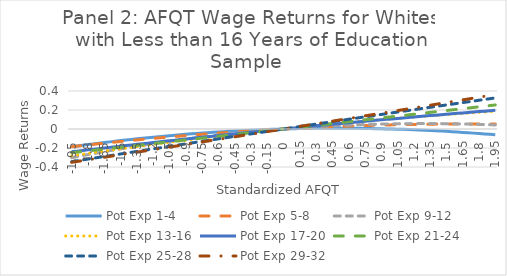
| Category | Pot Exp 1-4 | Pot Exp 5-8 | Pot Exp 9-12 | Pot Exp 13-16 | Pot Exp 17-20 | Pot Exp 21-24 | Pot Exp 25-28 | Pot Exp 29-32 |
|---|---|---|---|---|---|---|---|---|
| -1.95 | -0.188 | -0.186 | -0.302 | -0.282 | -0.24 | -0.25 | -0.344 | -0.351 |
| -1.9 | -0.18 | -0.18 | -0.291 | -0.273 | -0.233 | -0.244 | -0.335 | -0.342 |
| -1.8499999999999999 | -0.172 | -0.174 | -0.28 | -0.265 | -0.226 | -0.237 | -0.326 | -0.333 |
| -1.7999999999999998 | -0.164 | -0.167 | -0.269 | -0.257 | -0.22 | -0.231 | -0.317 | -0.324 |
| -1.7499999999999998 | -0.157 | -0.161 | -0.259 | -0.249 | -0.213 | -0.225 | -0.308 | -0.315 |
| -1.6999999999999997 | -0.15 | -0.155 | -0.249 | -0.24 | -0.207 | -0.218 | -0.299 | -0.306 |
| -1.6499999999999997 | -0.142 | -0.149 | -0.239 | -0.232 | -0.2 | -0.212 | -0.29 | -0.298 |
| -1.5999999999999996 | -0.136 | -0.143 | -0.229 | -0.224 | -0.194 | -0.205 | -0.281 | -0.289 |
| -1.5499999999999996 | -0.129 | -0.137 | -0.219 | -0.216 | -0.187 | -0.199 | -0.272 | -0.28 |
| -1.4999999999999996 | -0.122 | -0.132 | -0.209 | -0.208 | -0.181 | -0.193 | -0.263 | -0.271 |
| -1.4499999999999995 | -0.116 | -0.126 | -0.2 | -0.2 | -0.174 | -0.186 | -0.254 | -0.262 |
| -1.3999999999999995 | -0.109 | -0.12 | -0.19 | -0.193 | -0.168 | -0.18 | -0.245 | -0.253 |
| -1.3499999999999994 | -0.103 | -0.115 | -0.181 | -0.185 | -0.161 | -0.173 | -0.236 | -0.244 |
| -1.2999999999999994 | -0.097 | -0.109 | -0.172 | -0.177 | -0.155 | -0.167 | -0.227 | -0.235 |
| -1.2499999999999993 | -0.092 | -0.104 | -0.164 | -0.17 | -0.149 | -0.161 | -0.218 | -0.226 |
| -1.1999999999999993 | -0.086 | -0.099 | -0.155 | -0.162 | -0.142 | -0.154 | -0.209 | -0.217 |
| -1.1499999999999992 | -0.081 | -0.094 | -0.147 | -0.155 | -0.136 | -0.148 | -0.201 | -0.208 |
| -1.0999999999999992 | -0.075 | -0.089 | -0.138 | -0.147 | -0.13 | -0.141 | -0.192 | -0.199 |
| -1.0499999999999992 | -0.07 | -0.084 | -0.13 | -0.14 | -0.124 | -0.135 | -0.183 | -0.19 |
| -0.9999999999999991 | -0.065 | -0.079 | -0.122 | -0.133 | -0.118 | -0.129 | -0.174 | -0.181 |
| -0.9499999999999991 | -0.06 | -0.074 | -0.115 | -0.125 | -0.111 | -0.122 | -0.165 | -0.172 |
| -0.899999999999999 | -0.056 | -0.069 | -0.107 | -0.118 | -0.105 | -0.116 | -0.157 | -0.163 |
| -0.849999999999999 | -0.051 | -0.065 | -0.1 | -0.111 | -0.099 | -0.109 | -0.148 | -0.154 |
| -0.7999999999999989 | -0.047 | -0.06 | -0.092 | -0.104 | -0.093 | -0.103 | -0.139 | -0.145 |
| -0.7499999999999989 | -0.043 | -0.056 | -0.085 | -0.097 | -0.087 | -0.097 | -0.13 | -0.136 |
| -0.6999999999999988 | -0.039 | -0.052 | -0.079 | -0.09 | -0.081 | -0.09 | -0.121 | -0.127 |
| -0.6499999999999988 | -0.035 | -0.047 | -0.072 | -0.083 | -0.075 | -0.084 | -0.113 | -0.118 |
| -0.5999999999999988 | -0.031 | -0.043 | -0.065 | -0.077 | -0.069 | -0.077 | -0.104 | -0.109 |
| -0.5499999999999987 | -0.028 | -0.039 | -0.059 | -0.07 | -0.063 | -0.071 | -0.095 | -0.1 |
| -0.4999999999999987 | -0.024 | -0.035 | -0.053 | -0.063 | -0.057 | -0.064 | -0.087 | -0.091 |
| -0.44999999999999873 | -0.021 | -0.031 | -0.047 | -0.057 | -0.052 | -0.058 | -0.078 | -0.082 |
| -0.39999999999999875 | -0.018 | -0.027 | -0.041 | -0.05 | -0.046 | -0.052 | -0.069 | -0.073 |
| -0.34999999999999876 | -0.015 | -0.024 | -0.035 | -0.044 | -0.04 | -0.045 | -0.06 | -0.064 |
| -0.29999999999999877 | -0.013 | -0.02 | -0.03 | -0.037 | -0.034 | -0.039 | -0.052 | -0.055 |
| -0.24999999999999878 | -0.01 | -0.016 | -0.024 | -0.031 | -0.028 | -0.032 | -0.043 | -0.046 |
| -0.1999999999999988 | -0.008 | -0.013 | -0.019 | -0.025 | -0.023 | -0.026 | -0.034 | -0.037 |
| -0.1499999999999988 | -0.006 | -0.01 | -0.014 | -0.018 | -0.017 | -0.019 | -0.026 | -0.027 |
| -0.0999999999999988 | -0.004 | -0.006 | -0.009 | -0.012 | -0.011 | -0.013 | -0.017 | -0.018 |
| -0.049999999999998795 | -0.002 | -0.003 | -0.005 | -0.006 | -0.006 | -0.006 | -0.009 | -0.009 |
| 0.0 | 0 | 0 | 0 | 0 | 0 | 0 | 0 | 0 |
| 0.05 | 0.002 | 0.003 | 0.004 | 0.006 | 0.006 | 0.006 | 0.009 | 0.009 |
| 0.1 | 0.003 | 0.006 | 0.008 | 0.012 | 0.011 | 0.013 | 0.017 | 0.018 |
| 0.15000000000000002 | 0.004 | 0.009 | 0.012 | 0.018 | 0.017 | 0.019 | 0.026 | 0.027 |
| 0.2 | 0.005 | 0.012 | 0.016 | 0.023 | 0.022 | 0.026 | 0.034 | 0.037 |
| 0.25 | 0.006 | 0.014 | 0.02 | 0.029 | 0.028 | 0.032 | 0.043 | 0.046 |
| 0.3 | 0.007 | 0.017 | 0.023 | 0.035 | 0.033 | 0.039 | 0.051 | 0.055 |
| 0.35 | 0.007 | 0.019 | 0.027 | 0.04 | 0.039 | 0.045 | 0.06 | 0.064 |
| 0.39999999999999997 | 0.008 | 0.022 | 0.03 | 0.046 | 0.044 | 0.052 | 0.068 | 0.073 |
| 0.44999999999999996 | 0.008 | 0.024 | 0.033 | 0.051 | 0.049 | 0.058 | 0.077 | 0.083 |
| 0.49999999999999994 | 0.008 | 0.026 | 0.036 | 0.057 | 0.055 | 0.065 | 0.085 | 0.092 |
| 0.5499999999999999 | 0.008 | 0.028 | 0.038 | 0.062 | 0.06 | 0.071 | 0.094 | 0.101 |
| 0.6 | 0.008 | 0.03 | 0.041 | 0.067 | 0.065 | 0.078 | 0.102 | 0.11 |
| 0.65 | 0.007 | 0.032 | 0.043 | 0.073 | 0.07 | 0.084 | 0.111 | 0.12 |
| 0.7000000000000001 | 0.007 | 0.034 | 0.045 | 0.078 | 0.076 | 0.09 | 0.119 | 0.129 |
| 0.7500000000000001 | 0.006 | 0.036 | 0.047 | 0.083 | 0.081 | 0.097 | 0.128 | 0.138 |
| 0.8000000000000002 | 0.005 | 0.038 | 0.049 | 0.088 | 0.086 | 0.103 | 0.136 | 0.147 |
| 0.8500000000000002 | 0.004 | 0.039 | 0.05 | 0.093 | 0.091 | 0.11 | 0.145 | 0.157 |
| 0.9000000000000002 | 0.003 | 0.041 | 0.052 | 0.098 | 0.096 | 0.116 | 0.153 | 0.166 |
| 0.9500000000000003 | 0.001 | 0.042 | 0.053 | 0.103 | 0.101 | 0.123 | 0.161 | 0.175 |
| 1.0000000000000002 | 0 | 0.044 | 0.054 | 0.107 | 0.106 | 0.129 | 0.17 | 0.185 |
| 1.0500000000000003 | -0.002 | 0.045 | 0.055 | 0.112 | 0.111 | 0.136 | 0.178 | 0.194 |
| 1.1000000000000003 | -0.004 | 0.046 | 0.056 | 0.117 | 0.116 | 0.142 | 0.187 | 0.203 |
| 1.1500000000000004 | -0.006 | 0.047 | 0.056 | 0.121 | 0.121 | 0.149 | 0.195 | 0.213 |
| 1.2000000000000004 | -0.008 | 0.048 | 0.057 | 0.126 | 0.126 | 0.155 | 0.203 | 0.222 |
| 1.2500000000000004 | -0.011 | 0.049 | 0.057 | 0.13 | 0.131 | 0.162 | 0.212 | 0.231 |
| 1.3000000000000005 | -0.013 | 0.05 | 0.057 | 0.135 | 0.136 | 0.168 | 0.22 | 0.241 |
| 1.3500000000000005 | -0.016 | 0.051 | 0.057 | 0.139 | 0.141 | 0.175 | 0.228 | 0.25 |
| 1.4000000000000006 | -0.019 | 0.051 | 0.057 | 0.143 | 0.146 | 0.181 | 0.237 | 0.259 |
| 1.4500000000000006 | -0.022 | 0.052 | 0.056 | 0.148 | 0.151 | 0.188 | 0.245 | 0.269 |
| 1.5000000000000007 | -0.025 | 0.052 | 0.056 | 0.152 | 0.155 | 0.194 | 0.253 | 0.278 |
| 1.5500000000000007 | -0.028 | 0.053 | 0.055 | 0.156 | 0.16 | 0.201 | 0.261 | 0.288 |
| 1.6000000000000008 | -0.032 | 0.053 | 0.054 | 0.16 | 0.165 | 0.207 | 0.27 | 0.297 |
| 1.6500000000000008 | -0.036 | 0.053 | 0.053 | 0.164 | 0.17 | 0.214 | 0.278 | 0.306 |
| 1.7000000000000008 | -0.039 | 0.053 | 0.052 | 0.168 | 0.174 | 0.22 | 0.286 | 0.316 |
| 1.7500000000000009 | -0.043 | 0.053 | 0.05 | 0.171 | 0.179 | 0.227 | 0.294 | 0.325 |
| 1.800000000000001 | -0.048 | 0.053 | 0.048 | 0.175 | 0.183 | 0.233 | 0.303 | 0.335 |
| 1.850000000000001 | -0.052 | 0.053 | 0.047 | 0.179 | 0.188 | 0.24 | 0.311 | 0.344 |
| 1.900000000000001 | -0.056 | 0.053 | 0.045 | 0.183 | 0.193 | 0.246 | 0.319 | 0.354 |
| 1.950000000000001 | -0.061 | 0.053 | 0.043 | 0.186 | 0.197 | 0.253 | 0.327 | 0.363 |